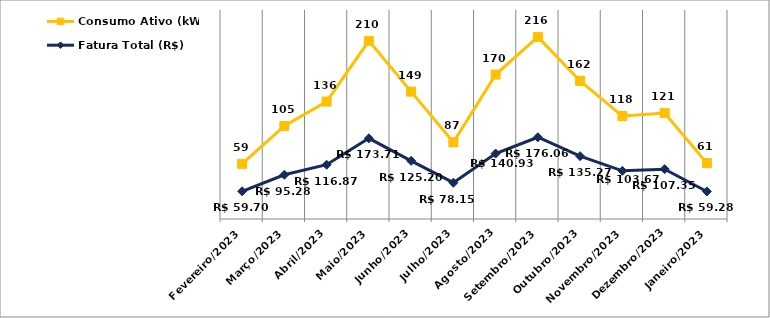
| Category | Fatura Total (R$) | Consumo Ativo (kWh) |
|---|---|---|
| Fevereiro/2023 | 59.7 | 59 |
| Março/2023 | 95.28 | 105 |
| Abril/2023 | 116.87 | 136 |
| Maio/2023 | 173.71 | 210 |
| Junho/2023 | 125.2 | 149 |
| Julho/2023 | 78.15 | 87 |
| Agosto/2023 | 140.93 | 170 |
| Setembro/2023 | 176.06 | 216 |
| Outubro/2023 | 135.27 | 162 |
| Novembro/2023 | 103.67 | 118 |
| Dezembro/2023 | 107.35 | 121 |
| Janeiro/2023 | 59.28 | 61 |